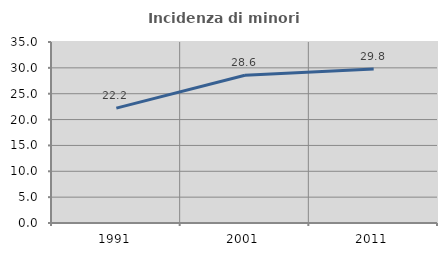
| Category | Incidenza di minori stranieri |
|---|---|
| 1991.0 | 22.222 |
| 2001.0 | 28.571 |
| 2011.0 | 29.801 |